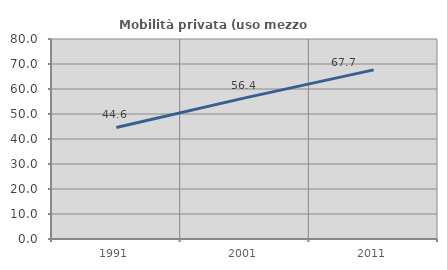
| Category | Mobilità privata (uso mezzo privato) |
|---|---|
| 1991.0 | 44.613 |
| 2001.0 | 56.437 |
| 2011.0 | 67.652 |